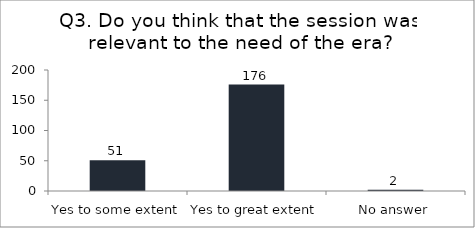
| Category | Q3. Do you think that the session was relevant to the need of the era? |
|---|---|
| Yes to some extent | 51 |
| Yes to great extent | 176 |
| No answer | 2 |